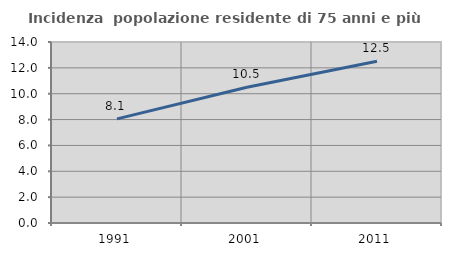
| Category | Incidenza  popolazione residente di 75 anni e più |
|---|---|
| 1991.0 | 8.052 |
| 2001.0 | 10.506 |
| 2011.0 | 12.514 |